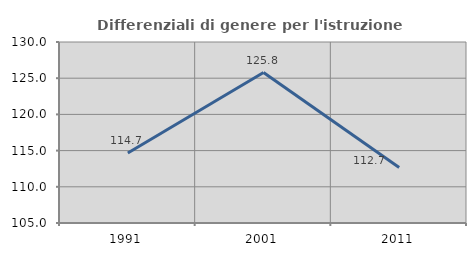
| Category | Differenziali di genere per l'istruzione superiore |
|---|---|
| 1991.0 | 114.667 |
| 2001.0 | 125.779 |
| 2011.0 | 112.671 |